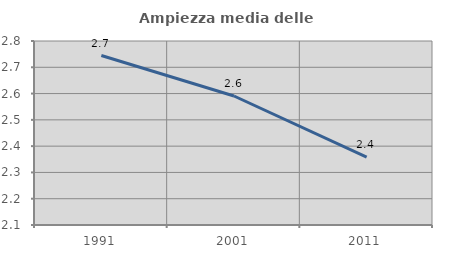
| Category | Ampiezza media delle famiglie |
|---|---|
| 1991.0 | 2.745 |
| 2001.0 | 2.591 |
| 2011.0 | 2.358 |